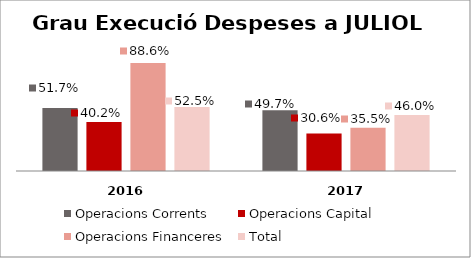
| Category | Operacions Corrents | Operacions Capital | Operacions Financeres | Total |
|---|---|---|---|---|
| 0 | 0.517 | 0.402 | 0.886 | 0.525 |
| 1 | 0.497 | 0.306 | 0.355 | 0.46 |